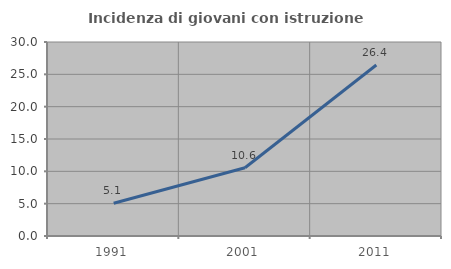
| Category | Incidenza di giovani con istruzione universitaria |
|---|---|
| 1991.0 | 5.061 |
| 2001.0 | 10.555 |
| 2011.0 | 26.441 |